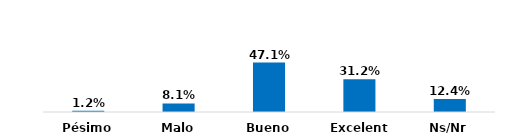
| Category | Series 0 |
|---|---|
| Pésimo | 0.012 |
| Malo | 0.081 |
| Bueno | 0.471 |
| Excelente | 0.312 |
| Ns/Nr | 0.124 |